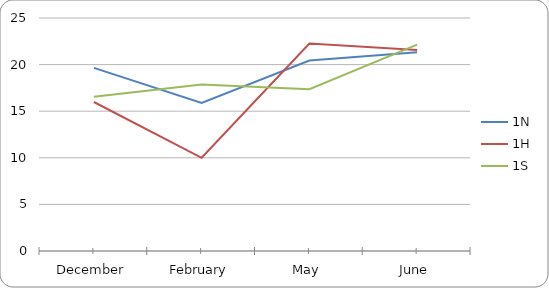
| Category | 1N | 1H | 1S |
|---|---|---|---|
| December | 19.648 | 15.986 | 16.551 |
| February | 15.875 | 10 | 17.862 |
| May | 20.432 | 22.264 | 17.364 |
| June | 21.316 | 21.577 | 22.147 |